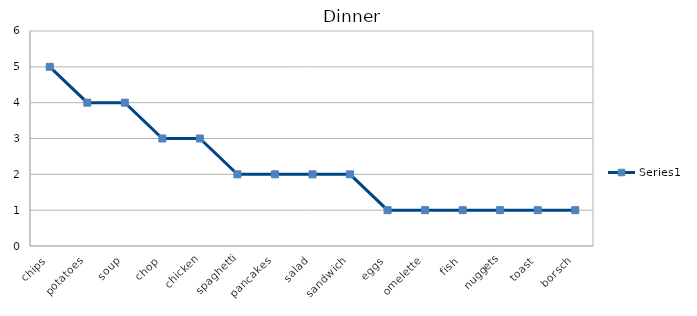
| Category | Series 0 |
|---|---|
| chips | 5 |
| potatoes | 4 |
| soup | 4 |
| chop | 3 |
| chicken | 3 |
| spaghetti | 2 |
| pancakes | 2 |
| salad | 2 |
| sandwich | 2 |
| eggs | 1 |
| omelette | 1 |
| fish | 1 |
| nuggets | 1 |
| toast | 1 |
| borsch | 1 |